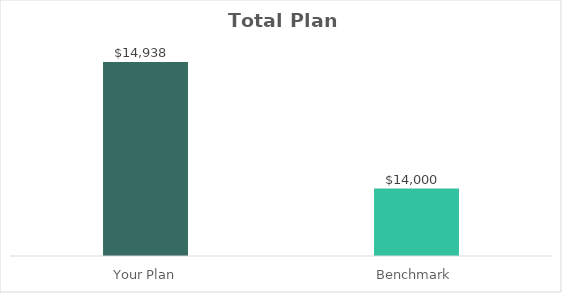
| Category | Series 0 |
|---|---|
| Your Plan | 14937.5 |
| Benchmark | 14000 |